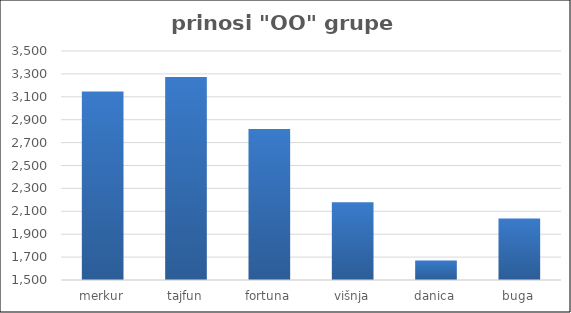
| Category | Series 0 |
|---|---|
| merkur | 3146.334 |
| tajfun | 3272.75 |
| fortuna | 2818.667 |
| višnja | 2178.6 |
| danica | 1670.31 |
| buga | 2037.4 |